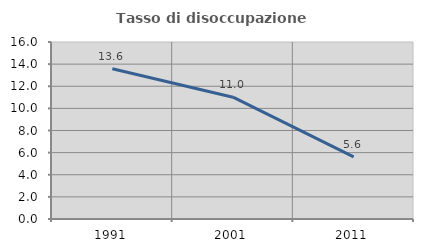
| Category | Tasso di disoccupazione giovanile  |
|---|---|
| 1991.0 | 13.587 |
| 2001.0 | 11.009 |
| 2011.0 | 5.618 |